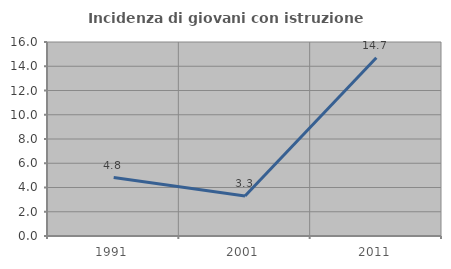
| Category | Incidenza di giovani con istruzione universitaria |
|---|---|
| 1991.0 | 4.819 |
| 2001.0 | 3.297 |
| 2011.0 | 14.706 |